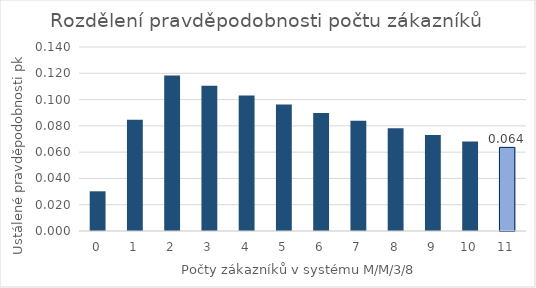
| Category | Series 0 |
|---|---|
| 0.0 | 0.03 |
| 1.0 | 0.085 |
| 2.0 | 0.118 |
| 3.0 | 0.111 |
| 4.0 | 0.103 |
| 5.0 | 0.096 |
| 6.0 | 0.09 |
| 7.0 | 0.084 |
| 8.0 | 0.078 |
| 9.0 | 0.073 |
| 10.0 | 0.068 |
| 11.0 | 0.064 |